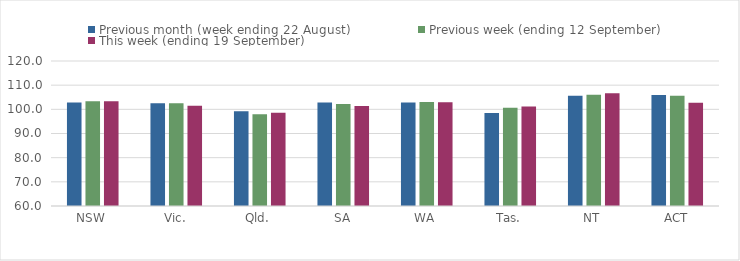
| Category | Previous month (week ending 22 August) | Previous week (ending 12 September) | This week (ending 19 September) |
|---|---|---|---|
| NSW | 102.86 | 103.36 | 103.32 |
| Vic. | 102.48 | 102.54 | 101.49 |
| Qld. | 99.25 | 97.94 | 98.58 |
| SA | 102.8 | 102.25 | 101.39 |
| WA | 102.82 | 103.01 | 102.89 |
| Tas. | 98.44 | 100.61 | 101.22 |
| NT | 105.62 | 105.99 | 106.62 |
| ACT | 105.9 | 105.62 | 102.77 |